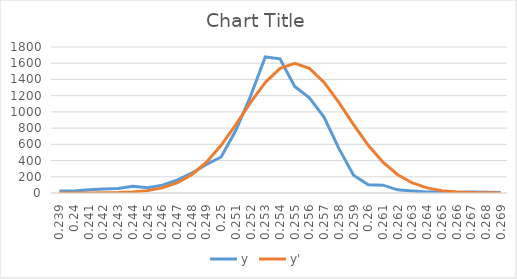
| Category | y | y' |
|---|---|---|
| 0.239 | 25 | 0.057 |
| 0.24 | 24 | 0.197 |
| 0.241 | 39 | 0.63 |
| 0.242 | 49 | 1.855 |
| 0.243 | 56 | 5.042 |
| 0.244 | 84 | 12.651 |
| 0.245 | 66 | 29.305 |
| 0.246 | 97 | 62.662 |
| 0.247 | 158 | 123.688 |
| 0.248 | 244 | 225.373 |
| 0.249 | 353 | 379.084 |
| 0.25 | 444 | 588.607 |
| 0.251 | 773 | 843.668 |
| 0.252 | 1196 | 1116.282 |
| 0.253 | 1677 | 1363.43 |
| 0.254 | 1654 | 1537.263 |
| 0.255 | 1314 | 1600 |
| 0.256 | 1173 | 1537.263 |
| 0.257 | 933 | 1363.43 |
| 0.258 | 550 | 1116.282 |
| 0.259 | 220 | 843.668 |
| 0.26 | 101 | 588.607 |
| 0.261 | 97 | 379.084 |
| 0.262 | 39 | 225.373 |
| 0.263 | 26 | 123.688 |
| 0.264 | 11 | 62.662 |
| 0.265 | 16 | 29.305 |
| 0.266 | 10 | 12.651 |
| 0.267 | 13 | 5.042 |
| 0.268 | 8 | 1.855 |
| 0.269 | 5 | 0.63 |